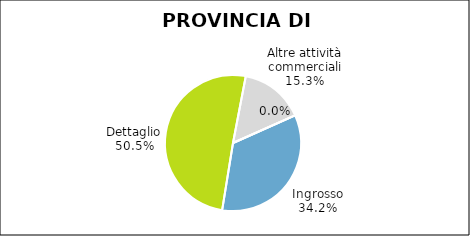
| Category | Provincia di Varese |
|---|---|
| Ingrosso | 6244 |
| Dettaglio | 9208 |
| Altre attività commerciali | 2796 |